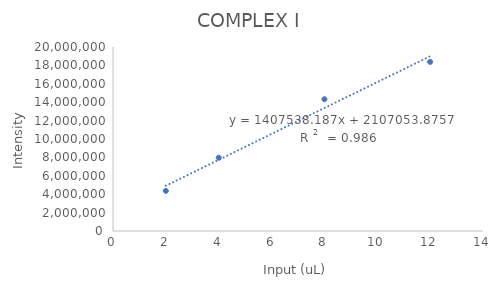
| Category | Series 0 |
|---|---|
| 8.0 | 14322340 |
| 4.0 | 7964098.667 |
| 2.0 | 4358624.364 |
| 12.0 | 18379145.333 |